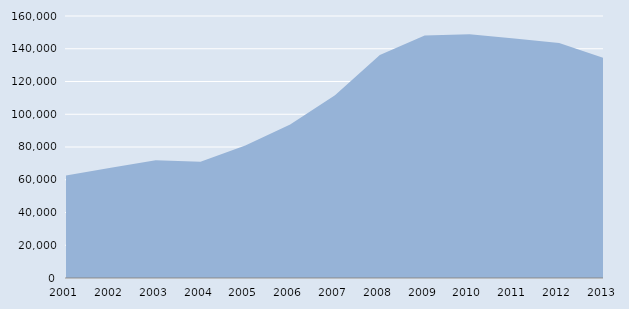
| Category | Series 0 |
|---|---|
| 2001.0 | 62610 |
| 2002.0 | 67313 |
| 2003.0 | 71843 |
| 2004.0 | 71065 |
| 2005.0 | 80846 |
| 2006.0 | 93767 |
| 2007.0 | 111575 |
| 2008.0 | 136171 |
| 2009.0 | 148154 |
| 2010.0 | 148789 |
| 2011.0 | 146298 |
| 2012.0 | 143488 |
| 2013.0 | 134248 |